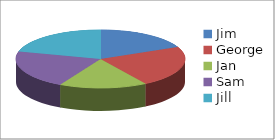
| Category | Series 0 |
|---|---|
| Jim | 36000 |
| George | 45000 |
| Jan | 33000 |
| Sam | 42000 |
| Jill | 41000 |